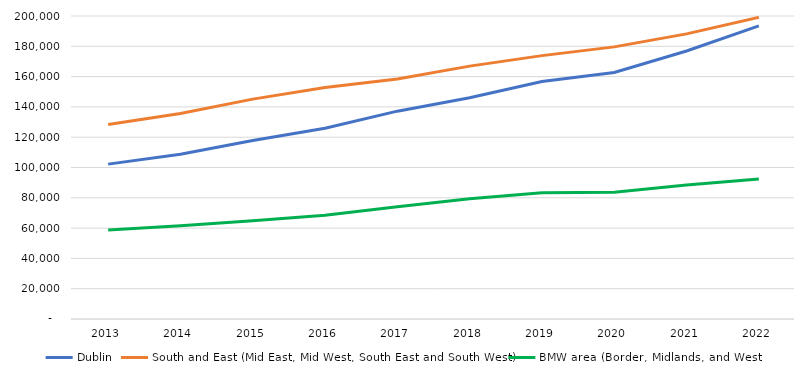
| Category | Dublin | South and East (Mid East, Mid West, South East and South West) | BMW area (Border, Midlands, and West) |
|---|---|---|---|
| 2013.0 | 102231 | 128410 | 58713 |
| 2014.0 | 108809 | 135692 | 61606 |
| 2015.0 | 117783 | 145140 | 64888 |
| 2016.0 | 125949 | 152871 | 68547 |
| 2017.0 | 137186 | 158481 | 74086 |
| 2018.0 | 146073 | 166925 | 79326 |
| 2019.0 | 156779 | 173849 | 83352 |
| 2020.0 | 162696 | 179620 | 83646 |
| 2021.0 | 176923 | 188182 | 88444 |
| 2022.0 | 193464 | 199115 | 92399 |